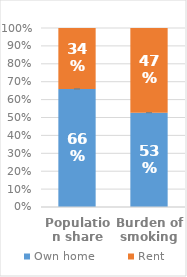
| Category | Own home | Rent |
|---|---|---|
| Population share | 0.66 | 0.34 |
| Burden of smoking | 0.527 | 0.473 |